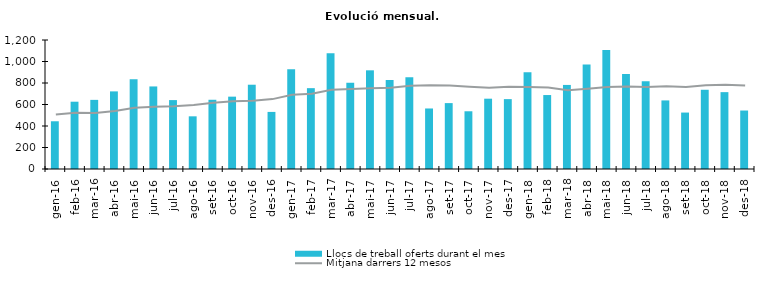
| Category | Llocs de treball oferts durant el mes |
|---|---|
| gen-16 | 444 |
| feb-16 | 626 |
| mar-16 | 643 |
| abr-16 | 722 |
| mai-16 | 835 |
| jun-16 | 768 |
| jul-16 | 641 |
| ago-16 | 490 |
| set-16 | 644 |
| oct-16 | 673 |
| nov-16 | 784 |
| des-16 | 531 |
| gen-17 | 927 |
| feb-17 | 752 |
| mar-17 | 1077 |
| abr-17 | 803 |
| mai-17 | 918 |
| jun-17 | 829 |
| jul-17 | 854 |
| ago-17 | 563 |
| set-17 | 613 |
| oct-17 | 537 |
| nov-17 | 654 |
| des-17 | 650 |
| gen-18 | 899 |
| feb-18 | 688 |
| mar-18 | 782 |
| abr-18 | 972 |
| mai-18 | 1108 |
| jun-18 | 884 |
| jul-18 | 816 |
| ago-18 | 638 |
| set-18 | 525 |
| oct-18 | 737 |
| nov-18 | 715 |
| des-18 | 544 |